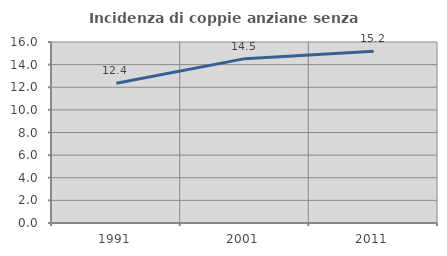
| Category | Incidenza di coppie anziane senza figli  |
|---|---|
| 1991.0 | 12.353 |
| 2001.0 | 14.53 |
| 2011.0 | 15.177 |